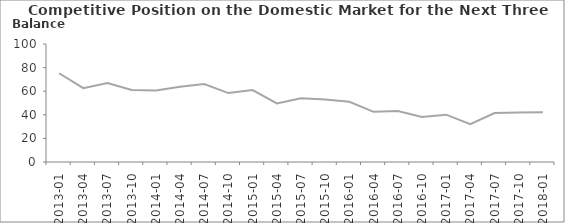
| Category | Balance |
|---|---|
| 2013-01 | 75.2 |
| 2013-04 | 62.6 |
| 2013-07 | 66.9 |
| 2013-10 | 61 |
| 2014-01 | 60.5 |
| 2014-04 | 63.8 |
| 2014-07 | 66.1 |
| 2014-10 | 58.4 |
| 2015-01 | 61 |
| 2015-04 | 49.7 |
| 2015-07 | 54.1 |
| 2015-10 | 52.9 |
| 2016-01 | 51 |
| 2016-04 | 42.5 |
| 2016-07 | 43.3 |
| 2016-10 | 38.2 |
| 2017-01 | 40.1 |
| 2017-04 | 32 |
| 2017-07 | 41.5 |
| 2017-10 | 42 |
| 2018-01 | 42.2 |